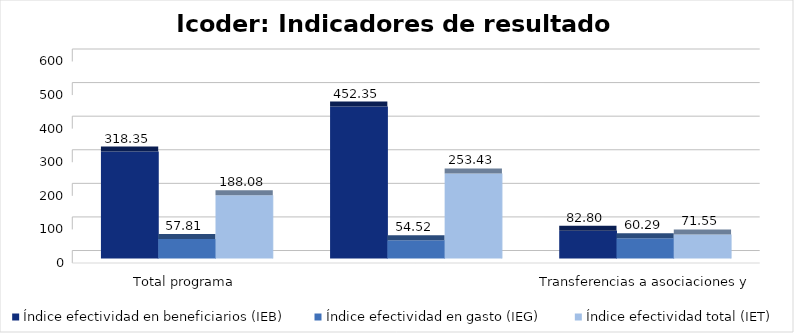
| Category | Índice efectividad en beneficiarios (IEB) | Índice efectividad en gasto (IEG)  | Índice efectividad total (IET) |
|---|---|---|---|
| Total programa | 318.352 | 57.812 | 188.082 |
| Transferencias a asociaciones y federaciones deportivas | 452.35 | 54.52 | 253.435 |
| Servicio de uso de parques e instalaciones deportivas | 82.801 | 60.293 | 71.547 |